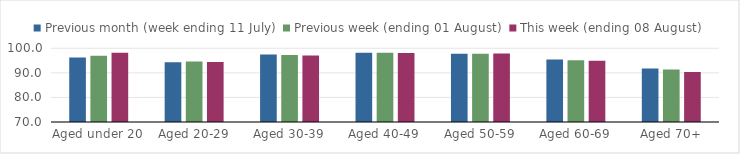
| Category | Previous month (week ending 11 July) | Previous week (ending 01 August) | This week (ending 08 August) |
|---|---|---|---|
| Aged under 20 | 96.278 | 96.916 | 98.157 |
| Aged 20-29 | 94.286 | 94.572 | 94.382 |
| Aged 30-39 | 97.455 | 97.293 | 97.047 |
| Aged 40-49 | 98.173 | 98.211 | 98.132 |
| Aged 50-59 | 97.81 | 97.798 | 97.928 |
| Aged 60-69 | 95.435 | 95.09 | 94.944 |
| Aged 70+ | 91.798 | 91.321 | 90.352 |